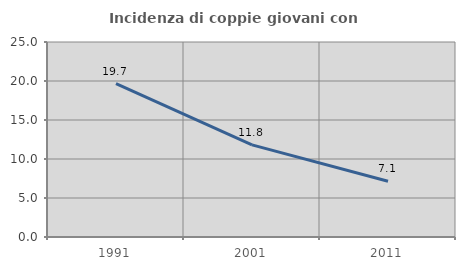
| Category | Incidenza di coppie giovani con figli |
|---|---|
| 1991.0 | 19.658 |
| 2001.0 | 11.814 |
| 2011.0 | 7.143 |